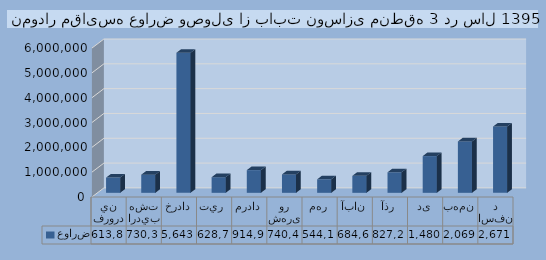
| Category | عوارض |
|---|---|
| فروردين | 613824 |
| ارديبهشت | 730337 |
| خرداد | 5643390 |
| تير  | 628740 |
| مرداد | 914939 |
| شهریور | 740481 |
| مهر | 544160 |
| آبان | 684650 |
| آذر | 827250 |
| دی | 1480026 |
| بهمن | 2069384 |
| اسفند | 2671659 |